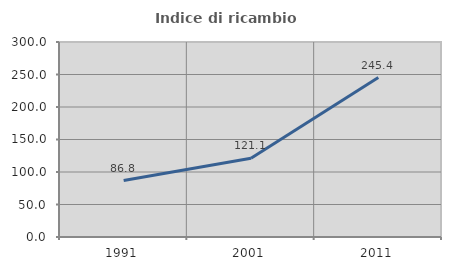
| Category | Indice di ricambio occupazionale  |
|---|---|
| 1991.0 | 86.826 |
| 2001.0 | 121.101 |
| 2011.0 | 245.356 |